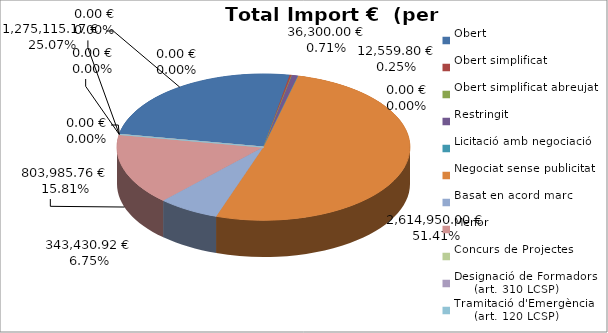
| Category | Total preu
(amb IVA) |
|---|---|
| Obert | 1275115.17 |
| Obert simplificat | 12559.8 |
| Obert simplificat abreujat | 0 |
| Restringit | 36300 |
| Licitació amb negociació | 0 |
| Negociat sense publicitat | 2614950 |
| Basat en acord marc | 343430.92 |
| Menor | 803985.76 |
| Concurs de Projectes | 0 |
| Designació de Formadors
     (art. 310 LCSP) | 0 |
| Tramitació d'Emergència
     (art. 120 LCSP) | 0 |